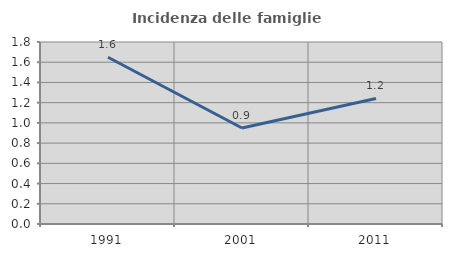
| Category | Incidenza delle famiglie numerose |
|---|---|
| 1991.0 | 1.649 |
| 2001.0 | 0.95 |
| 2011.0 | 1.242 |